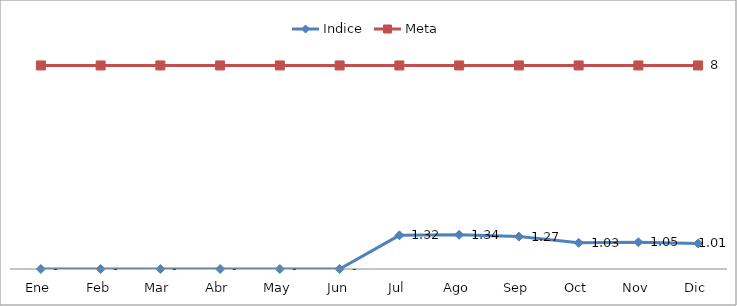
| Category | Indice | Meta |
|---|---|---|
| Ene | 0 | 8 |
| Feb | 0 | 8 |
| Mar | 0 | 8 |
| Abr | 0 | 8 |
| May | 0 | 8 |
| Jun | 0 | 8 |
| Jul | 1.322 | 8 |
| Ago | 1.341 | 8 |
| Sep | 1.273 | 8 |
| Oct | 1.028 | 8 |
| Nov | 1.05 | 8 |
| Dic | 1.007 | 8 |